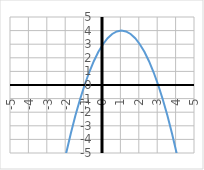
| Category | y |
|---|---|
| -5.0 | -32 |
| -4.75 | -29.062 |
| -4.5 | -26.25 |
| -4.25 | -23.562 |
| -4.0 | -21 |
| -3.75 | -18.562 |
| -3.5 | -16.25 |
| -3.25 | -14.062 |
| -3.0 | -12 |
| -2.75 | -10.062 |
| -2.5 | -8.25 |
| -2.25 | -6.562 |
| -2.0 | -5 |
| -1.75 | -3.562 |
| -1.5 | -2.25 |
| -1.25 | -1.062 |
| -1.0 | 0 |
| -0.75 | 0.938 |
| -0.5 | 1.75 |
| -0.25 | 2.438 |
| 0.0 | 3 |
| 0.25 | 3.438 |
| 0.5 | 3.75 |
| 0.75 | 3.938 |
| 1.0 | 4 |
| 1.25 | 3.938 |
| 1.5 | 3.75 |
| 1.75 | 3.438 |
| 2.0 | 3 |
| 2.25 | 2.438 |
| 2.5 | 1.75 |
| 2.75 | 0.938 |
| 3.0 | 0 |
| 3.25 | -1.062 |
| 3.5 | -2.25 |
| 3.75 | -3.562 |
| 4.0 | -5 |
| 4.25 | -6.562 |
| 4.5 | -8.25 |
| 4.75 | -10.062 |
| 5.0 | -12 |